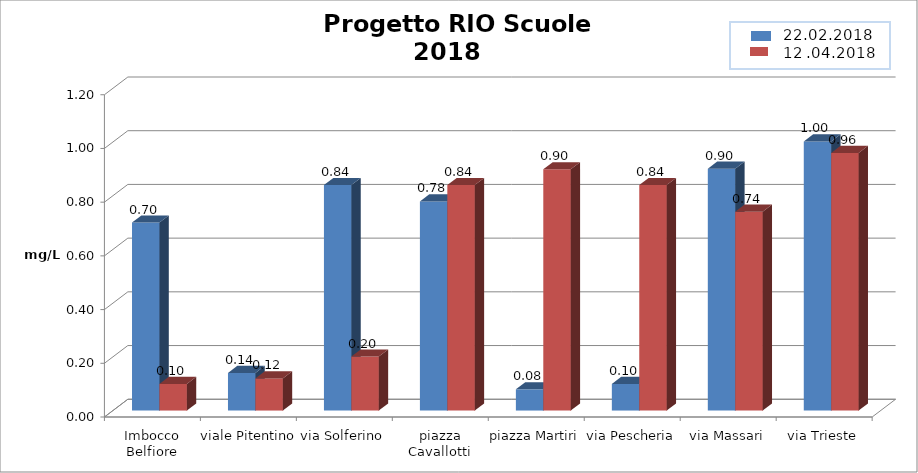
| Category | Series 0 | Series 1 |
|---|---|---|
| Imbocco Belfiore | 0.7 | 0.099 |
| viale Pitentino | 0.14 | 0.12 |
| via Solferino | 0.84 | 0.201 |
| piazza Cavallotti | 0.779 | 0.84 |
| piazza Martiri | 0.079 | 0.898 |
| via Pescheria | 0.099 | 0.84 |
| via Massari | 0.901 | 0.74 |
| via Trieste | 1.002 | 0.959 |